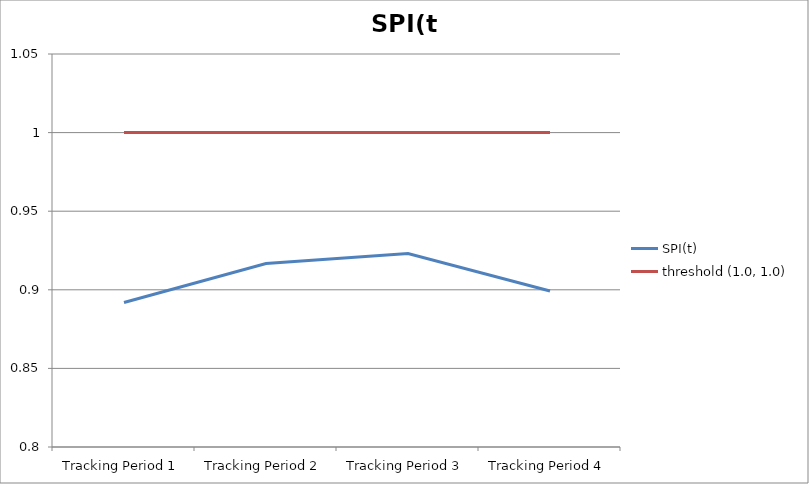
| Category | SPI(t) | threshold (1.0, 1.0) |
|---|---|---|
| Tracking Period 1 | 0.892 | 1 |
| Tracking Period 2 | 0.917 | 1 |
| Tracking Period 3 | 0.923 | 1 |
| Tracking Period 4 | 0.899 | 1 |